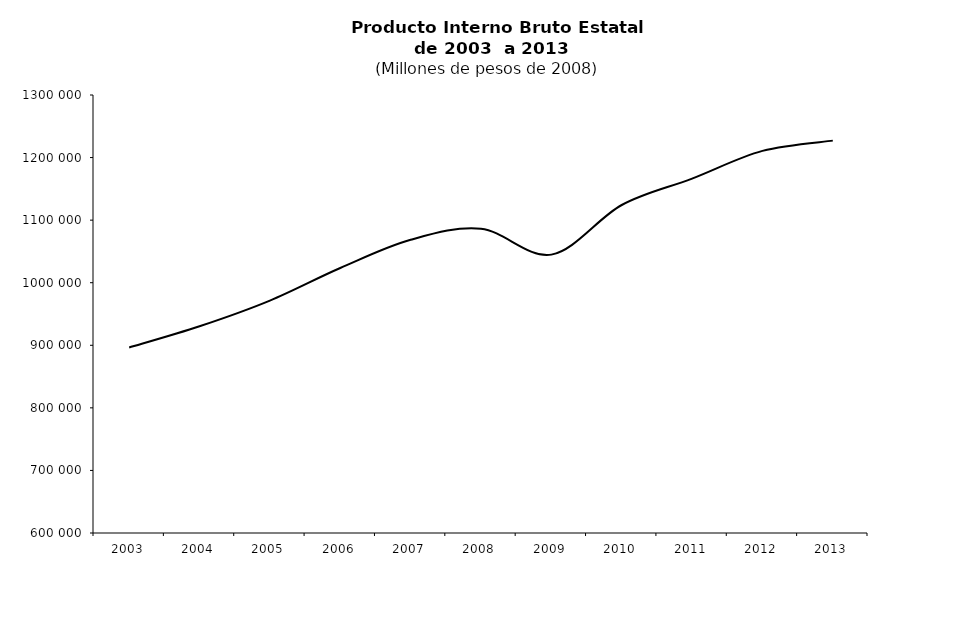
| Category | Producto Interno Bruto a precios de mercado E/ |
|---|---|
| 2003.0 | 896489.602 |
| 2004.0 | 930408.594 |
| 2005.0 | 971427.024 |
| 2006.0 | 1023450.371 |
| 2007.0 | 1068581.79 |
| 2008.0 | 1086260.887 |
| 2009.0 | 1044911.726 |
| 2010.0 | 1124194.431 |
| 2011.0 | 1166399.486 |
| 2012.0 | 1210658.132 |
| 2013.0 | 1227098.841 |